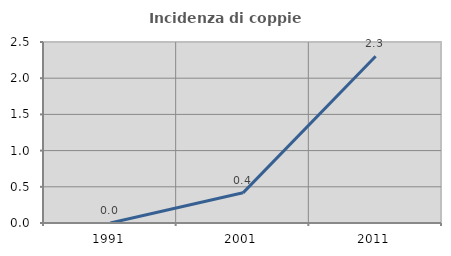
| Category | Incidenza di coppie miste |
|---|---|
| 1991.0 | 0 |
| 2001.0 | 0.417 |
| 2011.0 | 2.304 |